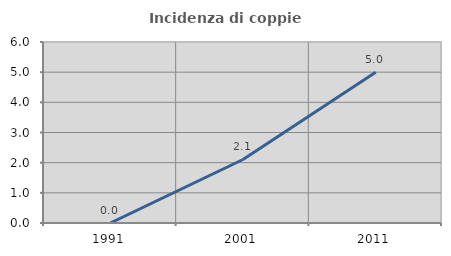
| Category | Incidenza di coppie miste |
|---|---|
| 1991.0 | 0 |
| 2001.0 | 2.105 |
| 2011.0 | 5 |